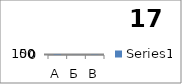
| Category | Series 0 |
|---|---|
| А | 92 |
| Б | 17 |
| В | 55 |